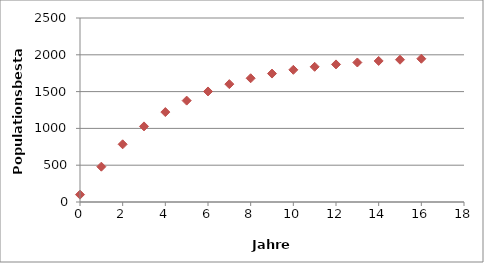
| Category | Series 0 |
|---|---|
| 0.0 | 100 |
| 1.0 | 480 |
| 2.0 | 784 |
| 3.0 | 1027.2 |
| 4.0 | 1221.76 |
| 5.0 | 1377.408 |
| 6.0 | 1501.926 |
| 7.0 | 1601.541 |
| 8.0 | 1681.233 |
| 9.0 | 1744.986 |
| 10.0 | 1795.989 |
| 11.0 | 1836.791 |
| 12.0 | 1869.433 |
| 13.0 | 1895.546 |
| 14.0 | 1916.437 |
| 15.0 | 1933.15 |
| 16.0 | 1946.52 |